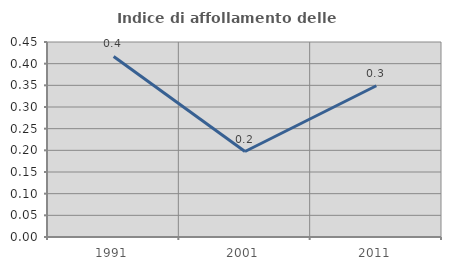
| Category | Indice di affollamento delle abitazioni  |
|---|---|
| 1991.0 | 0.417 |
| 2001.0 | 0.197 |
| 2011.0 | 0.349 |